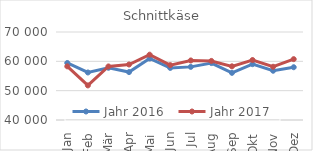
| Category | Jahr 2016 | Jahr 2017 |
|---|---|---|
| Jan | 59436.859 | 58290.12 |
| Feb | 56200.075 | 51790.597 |
| Mär | 57807.997 | 58255.965 |
| Apr | 56334.596 | 58922.796 |
| Mai | 60978 | 62264.567 |
| Jun | 57758.102 | 58707.071 |
| Jul | 58110.823 | 60293.917 |
| Aug | 59408.432 | 60139.21 |
| Sep | 56071.958 | 58297.863 |
| Okt | 59028.973 | 60451.73 |
| Nov | 56792.068 | 58144.804 |
| Dez | 57992.676 | 60744.893 |